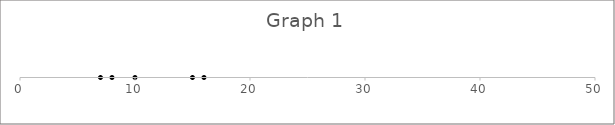
| Category | Series 0 |
|---|---|
| 7.0 | 0 |
| 8.0 | 0 |
| 10.0 | 0 |
| 15.0 | 0 |
| 16.0 | 0 |
| nan | 0 |
| nan | 0 |
| nan | 0 |
| nan | 0 |
| nan | 0 |
| nan | 0 |
| nan | 0 |
| nan | 0 |
| nan | 0 |
| nan | 0 |